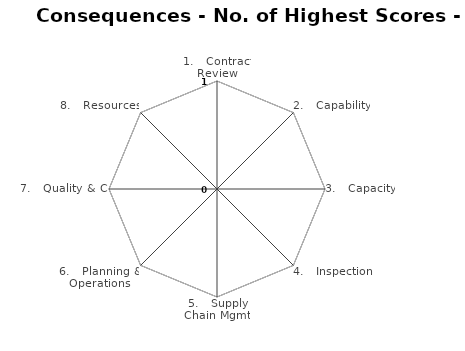
| Category | Series 0 |
|---|---|
| 1.   Contract Review | 0 |
| 2.   Capability | 0 |
| 3.   Capacity | 0 |
| 4.   Inspection  | 0 |
| 5.   Supply Chain Mgmt | 0 |
| 6.   Planning & Operations | 0 |
| 7.   Quality & CI | 0 |
| 8.   Resources | 0 |